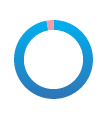
| Category | Series 0 |
|---|---|
| 0 | 177151012 |
| 1 | 5178988 |